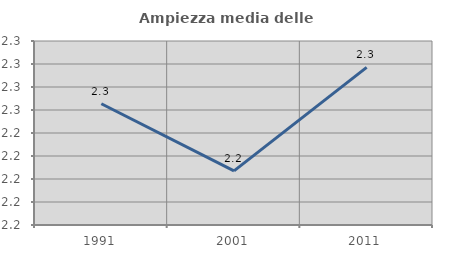
| Category | Ampiezza media delle famiglie |
|---|---|
| 1991.0 | 2.265 |
| 2001.0 | 2.207 |
| 2011.0 | 2.297 |